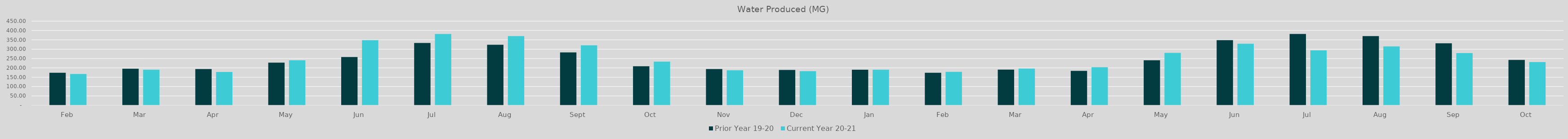
| Category | Prior Year 19-20  | Current Year 20-21 |
|---|---|---|
| Feb | 173.847 | 167.532 |
| Mar | 195.333 | 190.306 |
| Apr | 193.551 | 178.22 |
| May | 228.091 | 240.625 |
| Jun | 257.9 | 348.57 |
| Jul | 333.37 | 381.34 |
| Aug | 323.49 | 370.12 |
| Sep | 282.53 | 320.39 |
| Oct | 208.72 | 233.34 |
| Nov | 193.92 | 187.14 |
| Dec | 188.86 | 182.02 |
| Jan | 189.94 | 189.96 |
| Feb | 173.75 | 178.97 |
| Mar | 190.77 | 195.96 |
| Apr | 184.23 | 203.05 |
| May | 240.63 | 280.19 |
| Jun | 348.57 | 329.038 |
| Jul | 381.336 | 293.585 |
| Aug | 370.12 | 314.51 |
| Sep | 331.274 | 279.105 |
| Oct | 242.616 | 230.878 |